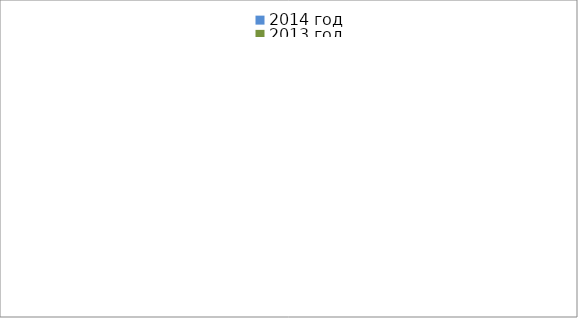
| Category | 2014 год | 2013 год |
|---|---|---|
|  - поджог | 27 | 35 |
|  - неосторожное обращение с огнём | 51 | 73 |
|  - НПТЭ электрооборудования | 21 | 22 |
|  - НПУ и Э печей | 77 | 66 |
|  - НПУ и Э транспортных средств | 73 | 62 |
|   -Шалость с огнем детей | 0 | 4 |
|  -НППБ при эксплуатации эл.приборов | 20 | 30 |
|  - курение | 22 | 12 |
| - прочие | 99 | 96 |
| - не установленные причины | 8 | 3 |